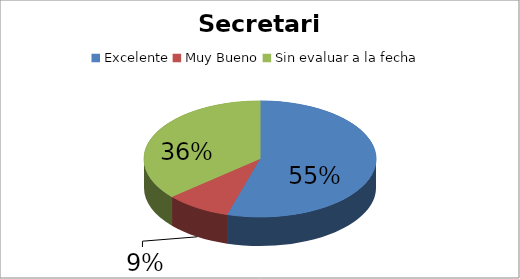
| Category | Cantidad |
|---|---|
| Excelente | 6 |
| Muy Bueno | 1 |
| Sin evaluar a la fecha | 4 |